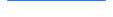
| Category | Series 0 |
|---|---|
| 0 | 73 |
| 1 | 70 |
| 2 | 69 |
| 3 | 83 |
| 4 | 82 |
| 5 | 90 |
| 6 | 81 |
| 7 | 76 |
| 8 | 89 |